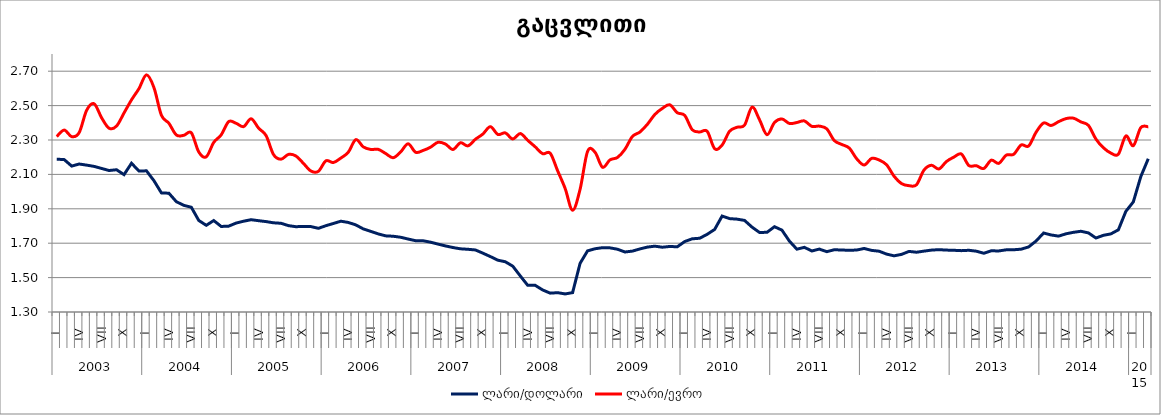
| Category | ლარი/დოლარი | ლარი/ევრო |
|---|---|---|
| 0 | 2.188 | 2.32 |
| 1 | 2.186 | 2.358 |
| 2 | 2.148 | 2.32 |
| 3 | 2.16 | 2.343 |
| 4 | 2.154 | 2.473 |
| 5 | 2.146 | 2.51 |
| 6 | 2.135 | 2.429 |
| 7 | 2.123 | 2.368 |
| 8 | 2.127 | 2.381 |
| 9 | 2.099 | 2.457 |
| 10 | 2.165 | 2.533 |
| 11 | 2.119 | 2.599 |
| 12 | 2.121 | 2.679 |
| 13 | 2.064 | 2.605 |
| 14 | 1.992 | 2.444 |
| 15 | 1.991 | 2.397 |
| 16 | 1.941 | 2.329 |
| 17 | 1.92 | 2.327 |
| 18 | 1.909 | 2.342 |
| 19 | 1.832 | 2.23 |
| 20 | 1.804 | 2.202 |
| 21 | 1.832 | 2.286 |
| 22 | 1.797 | 2.33 |
| 23 | 1.799 | 2.407 |
| 24 | 1.817 | 2.397 |
| 25 | 1.828 | 2.378 |
| 26 | 1.837 | 2.424 |
| 27 | 1.831 | 2.369 |
| 28 | 1.826 | 2.326 |
| 29 | 1.819 | 2.215 |
| 30 | 1.816 | 2.188 |
| 31 | 1.802 | 2.216 |
| 32 | 1.796 | 2.207 |
| 33 | 1.798 | 2.164 |
| 34 | 1.797 | 2.12 |
| 35 | 1.786 | 2.118 |
| 36 | 1.802 | 2.179 |
| 37 | 1.815 | 2.169 |
| 38 | 1.828 | 2.195 |
| 39 | 1.821 | 2.229 |
| 40 | 1.806 | 2.302 |
| 41 | 1.783 | 2.26 |
| 42 | 1.769 | 2.245 |
| 43 | 1.754 | 2.246 |
| 44 | 1.743 | 2.221 |
| 45 | 1.74 | 2.197 |
| 46 | 1.735 | 2.23 |
| 47 | 1.724 | 2.278 |
| 48 | 1.714 | 2.229 |
| 49 | 1.714 | 2.239 |
| 50 | 1.706 | 2.258 |
| 51 | 1.695 | 2.287 |
| 52 | 1.684 | 2.276 |
| 53 | 1.675 | 2.245 |
| 54 | 1.667 | 2.284 |
| 55 | 1.665 | 2.266 |
| 56 | 1.661 | 2.304 |
| 57 | 1.642 | 2.335 |
| 58 | 1.622 | 2.378 |
| 59 | 1.601 | 2.332 |
| 60 | 1.592 | 2.341 |
| 61 | 1.566 | 2.306 |
| 62 | 1.51 | 2.338 |
| 63 | 1.455 | 2.298 |
| 64 | 1.455 | 2.26 |
| 65 | 1.428 | 2.22 |
| 66 | 1.41 | 2.223 |
| 67 | 1.412 | 2.121 |
| 68 | 1.405 | 2.019 |
| 69 | 1.413 | 1.892 |
| 70 | 1.583 | 2.013 |
| 71 | 1.655 | 2.233 |
| 72 | 1.668 | 2.229 |
| 73 | 1.674 | 2.141 |
| 74 | 1.673 | 2.184 |
| 75 | 1.665 | 2.198 |
| 76 | 1.649 | 2.246 |
| 77 | 1.654 | 2.321 |
| 78 | 1.667 | 2.346 |
| 79 | 1.677 | 2.391 |
| 80 | 1.683 | 2.448 |
| 81 | 1.677 | 2.484 |
| 82 | 1.681 | 2.504 |
| 83 | 1.679 | 2.459 |
| 84 | 1.71 | 2.443 |
| 85 | 1.726 | 2.36 |
| 86 | 1.729 | 2.347 |
| 87 | 1.752 | 2.351 |
| 88 | 1.78 | 2.25 |
| 89 | 1.858 | 2.271 |
| 90 | 1.843 | 2.351 |
| 91 | 1.84 | 2.374 |
| 92 | 1.832 | 2.386 |
| 93 | 1.794 | 2.491 |
| 94 | 1.762 | 2.418 |
| 95 | 1.763 | 2.331 |
| 96 | 1.796 | 2.402 |
| 97 | 1.776 | 2.422 |
| 98 | 1.712 | 2.396 |
| 99 | 1.665 | 2.402 |
| 100 | 1.676 | 2.411 |
| 101 | 1.655 | 2.379 |
| 102 | 1.666 | 2.381 |
| 103 | 1.651 | 2.365 |
| 104 | 1.662 | 2.297 |
| 105 | 1.66 | 2.274 |
| 106 | 1.659 | 2.253 |
| 107 | 1.66 | 2.191 |
| 108 | 1.669 | 2.155 |
| 109 | 1.658 | 2.193 |
| 110 | 1.653 | 2.184 |
| 111 | 1.637 | 2.156 |
| 112 | 1.627 | 2.089 |
| 113 | 1.635 | 2.047 |
| 114 | 1.652 | 2.034 |
| 115 | 1.648 | 2.04 |
| 116 | 1.654 | 2.125 |
| 117 | 1.66 | 2.153 |
| 118 | 1.662 | 2.132 |
| 119 | 1.66 | 2.175 |
| 120 | 1.659 | 2.201 |
| 121 | 1.657 | 2.219 |
| 122 | 1.659 | 2.152 |
| 123 | 1.654 | 2.151 |
| 124 | 1.642 | 2.134 |
| 125 | 1.656 | 2.183 |
| 126 | 1.655 | 2.164 |
| 127 | 1.662 | 2.212 |
| 128 | 1.662 | 2.217 |
| 129 | 1.665 | 2.271 |
| 130 | 1.678 | 2.265 |
| 131 | 1.713 | 2.346 |
| 132 | 1.759 | 2.399 |
| 133 | 1.748 | 2.384 |
| 134 | 1.741 | 2.406 |
| 135 | 1.755 | 2.424 |
| 136 | 1.763 | 2.427 |
| 137 | 1.769 | 2.405 |
| 138 | 1.76 | 2.385 |
| 139 | 1.73 | 2.306 |
| 140 | 1.746 | 2.255 |
| 141 | 1.754 | 2.224 |
| 142 | 1.778 | 2.217 |
| 143 | 1.885 | 2.323 |
| 144 | 1.94 | 2.267 |
| 145 | 2.087 | 2.372 |
| 146 | 2.191 | 2.377 |